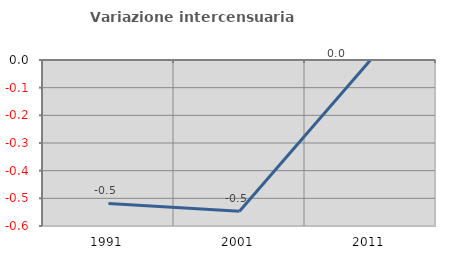
| Category | Variazione intercensuaria annua |
|---|---|
| 1991.0 | -0.518 |
| 2001.0 | -0.547 |
| 2011.0 | 0 |